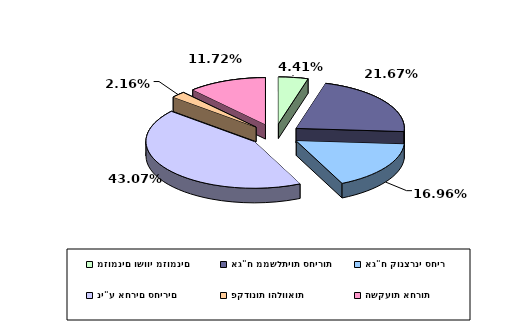
| Category | Series 0 |
|---|---|
| מזומנים ושווי מזומנים | 0.044 |
| אג"ח ממשלתיות סחירות | 0.217 |
| אג"ח קונצרני סחיר | 0.17 |
| ני"ע אחרים סחירים | 0.431 |
| פקדונות והלוואות | 0.022 |
| השקעות אחרות | 0.117 |